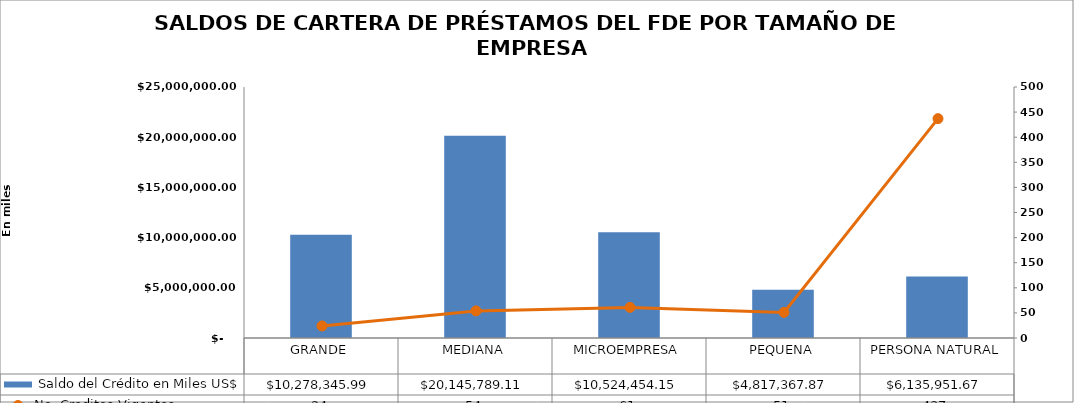
| Category |  Saldo del Crédito en Miles US$ |
|---|---|
| GRANDE | 10278345.99 |
| MEDIANA | 20145789.11 |
| MICROEMPRESA | 10524454.15 |
| PEQUENA | 4817367.87 |
| PERSONA NATURAL | 6135951.67 |